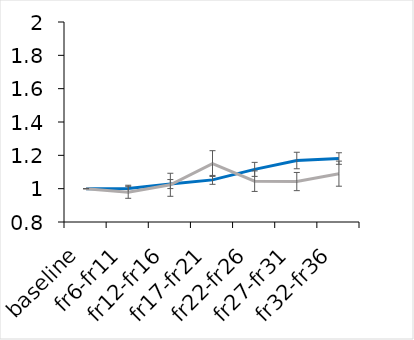
| Category | Series 0 | Series 1 |
|---|---|---|
| baseline | 1 | 1 |
| fr6-fr11 | 1.001 | 0.978 |
| fr12-fr16 | 1.028 | 1.023 |
| fr17-fr21 | 1.053 | 1.151 |
| fr22-fr26 | 1.116 | 1.045 |
| fr27-fr31 | 1.169 | 1.043 |
| fr32-fr36 | 1.181 | 1.09 |